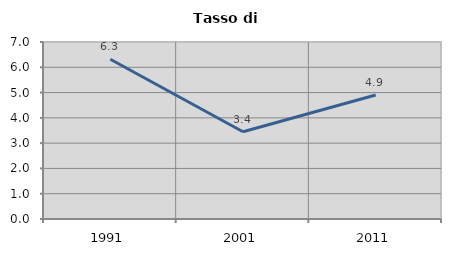
| Category | Tasso di disoccupazione   |
|---|---|
| 1991.0 | 6.319 |
| 2001.0 | 3.448 |
| 2011.0 | 4.904 |